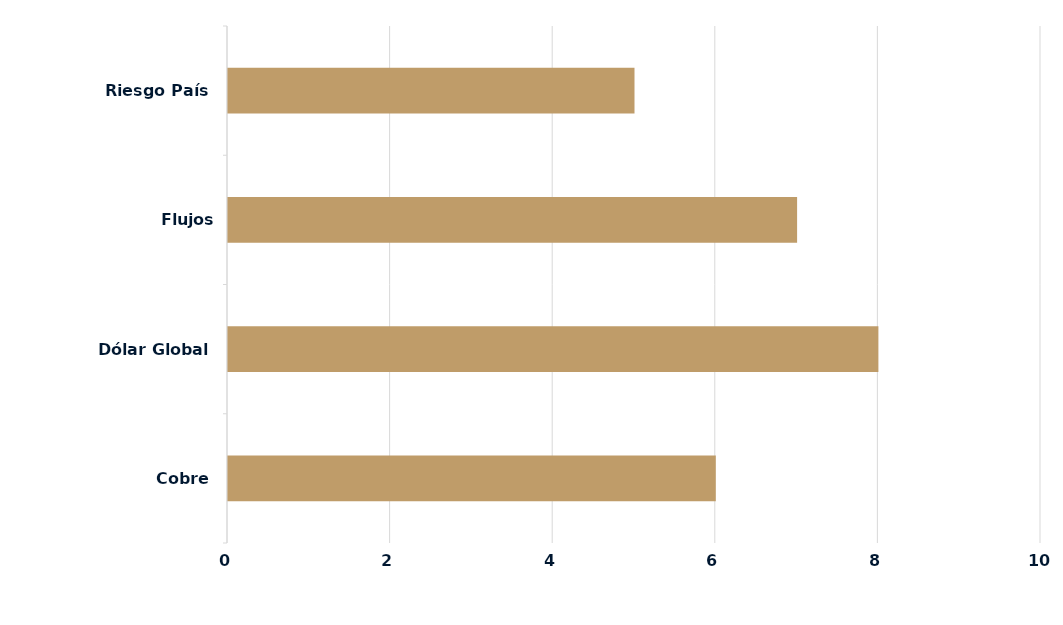
| Category | Series 0 |
|---|---|
| Cobre | 6 |
| Dólar Global | 8 |
| Flujos Locales/Extranjeros | 7 |
| Riesgo País | 5 |